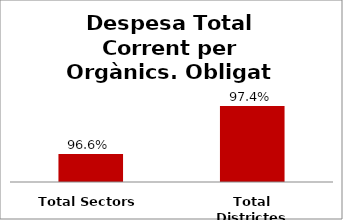
| Category | Series 0 |
|---|---|
| Total Sectors | 0.966 |
| Total Districtes | 0.974 |